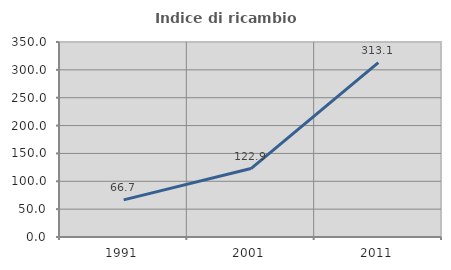
| Category | Indice di ricambio occupazionale  |
|---|---|
| 1991.0 | 66.667 |
| 2001.0 | 122.892 |
| 2011.0 | 313.068 |